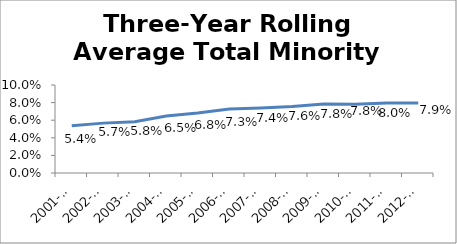
| Category | Three-Year Rolling Average Total Minority |
|---|---|
| 2001-2003 | 0.054 |
| 2002-2004 | 0.057 |
| 2003-2005 | 0.058 |
| 2004-2006 | 0.065 |
| 2005-2007 | 0.068 |
| 2006-2008 | 0.073 |
| 2007-2009 | 0.074 |
| 2008-2010 | 0.076 |
| 2009-2011 | 0.078 |
| 2010-2012 | 0.078 |
| 2011-2013 | 0.08 |
| 2012-2014 | 0.079 |